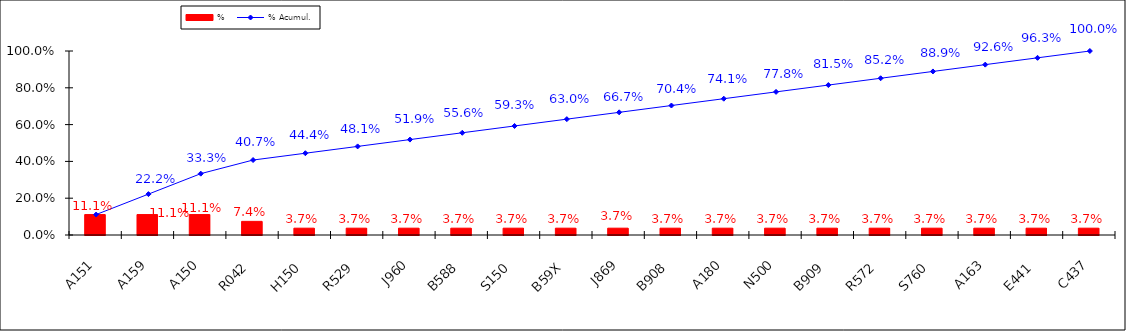
| Category | % |
|---|---|
| A151 | 0.111 |
| A159 | 0.111 |
| A150 | 0.111 |
| R042 | 0.074 |
| H150 | 0.037 |
| R529 | 0.037 |
| J960 | 0.037 |
| B588 | 0.037 |
| S150 | 0.037 |
| B59X | 0.037 |
| J869 | 0.037 |
| B908 | 0.037 |
| A180 | 0.037 |
| N500 | 0.037 |
| B909 | 0.037 |
| R572 | 0.037 |
| S760 | 0.037 |
| A163 | 0.037 |
| E441 | 0.037 |
| C437 | 0.037 |